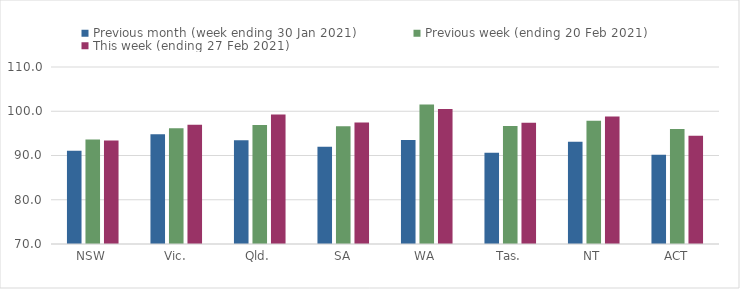
| Category | Previous month (week ending 30 Jan 2021) | Previous week (ending 20 Feb 2021) | This week (ending 27 Feb 2021) |
|---|---|---|---|
| NSW | 91.06 | 93.6 | 93.39 |
| Vic. | 94.81 | 96.14 | 96.94 |
| Qld. | 93.47 | 96.87 | 99.25 |
| SA | 91.96 | 96.62 | 97.43 |
| WA | 93.53 | 101.54 | 100.51 |
| Tas. | 90.62 | 96.68 | 97.41 |
| NT | 93.1 | 97.86 | 98.84 |
| ACT | 90.17 | 95.99 | 94.47 |